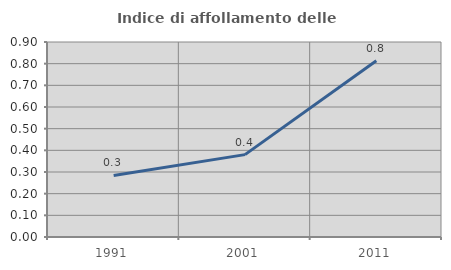
| Category | Indice di affollamento delle abitazioni  |
|---|---|
| 1991.0 | 0.284 |
| 2001.0 | 0.38 |
| 2011.0 | 0.814 |